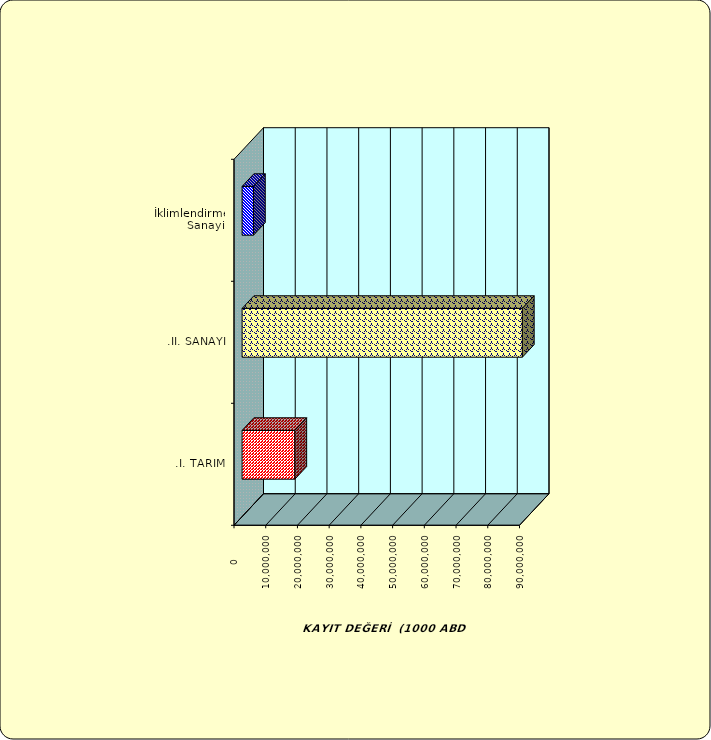
| Category | Series 0 |
|---|---|
| .I. TARIM | 16627578.072 |
| .II. SANAYİ | 88357308.223 |
|  İklimlendirme Sanayii | 3586517.114 |